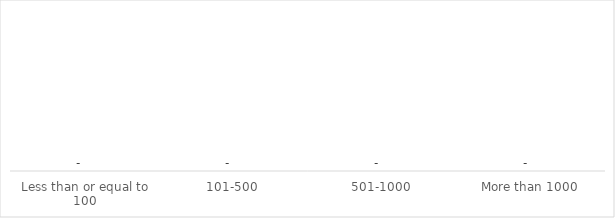
| Category | Series 0 |
|---|---|
| Less than or equal to 100 | 0 |
| 101-500 | 0 |
| 501-1000 | 0 |
| More than 1000 | 0 |